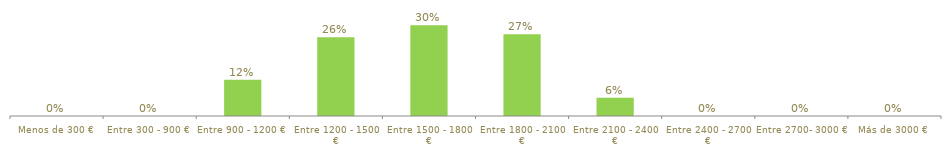
| Category | Series 0 |
|---|---|
| Menos de 300 € | 0 |
| Entre 300 - 900 € | 0 |
| Entre 900 - 1200 € | 0.12 |
| Entre 1200 - 1500 € | 0.26 |
| Entre 1500 - 1800 € | 0.3 |
| Entre 1800 - 2100 € | 0.27 |
| Entre 2100 - 2400 € | 0.06 |
| Entre 2400 - 2700 € | 0 |
| Entre 2700- 3000 € | 0 |
| Más de 3000 € | 0 |